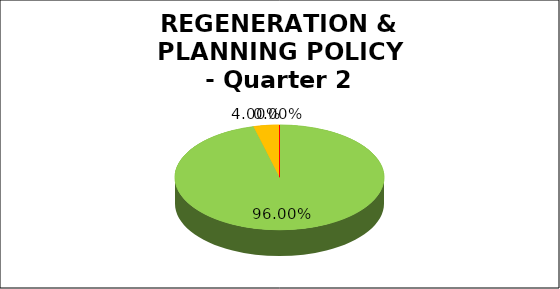
| Category | Q2 |
|---|---|
| Green | 0.96 |
| Amber | 0.04 |
| Red | 0 |